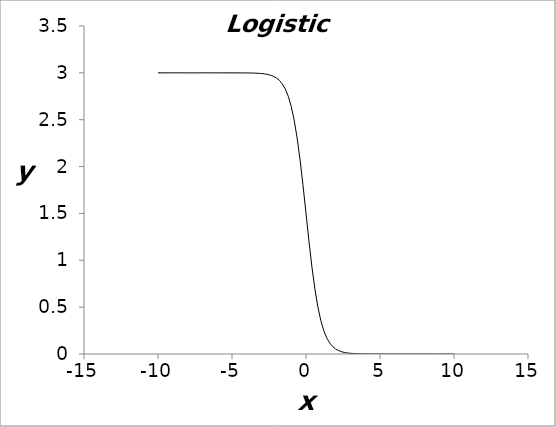
| Category | Series 0 |
|---|---|
| -10.0 | 3 |
| -9.8 | 3 |
| -9.600000000000001 | 3 |
| -9.400000000000002 | 3 |
| -9.200000000000003 | 3 |
| -9.000000000000004 | 3 |
| -8.800000000000004 | 3 |
| -8.600000000000005 | 3 |
| -8.400000000000006 | 3 |
| -8.200000000000006 | 3 |
| -8.000000000000007 | 3 |
| -7.800000000000007 | 3 |
| -7.600000000000007 | 3 |
| -7.400000000000006 | 3 |
| -7.200000000000006 | 3 |
| -7.000000000000006 | 3 |
| -6.800000000000006 | 3 |
| -6.600000000000006 | 3 |
| -6.400000000000005 | 3 |
| -6.200000000000005 | 3 |
| -6.000000000000005 | 3 |
| -5.800000000000005 | 3 |
| -5.600000000000005 | 3 |
| -5.400000000000004 | 3 |
| -5.200000000000004 | 3 |
| -5.000000000000004 | 3 |
| -4.800000000000004 | 3 |
| -4.600000000000004 | 3 |
| -4.400000000000004 | 3 |
| -4.200000000000004 | 2.999 |
| -4.000000000000004 | 2.999 |
| -3.800000000000003 | 2.998 |
| -3.600000000000003 | 2.998 |
| -3.400000000000003 | 2.997 |
| -3.200000000000003 | 2.995 |
| -3.000000000000003 | 2.993 |
| -2.800000000000002 | 2.989 |
| -2.600000000000002 | 2.984 |
| -2.400000000000002 | 2.976 |
| -2.200000000000002 | 2.964 |
| -2.000000000000002 | 2.946 |
| -1.800000000000002 | 2.92 |
| -1.600000000000002 | 2.883 |
| -1.400000000000002 | 2.828 |
| -1.200000000000002 | 2.75 |
| -1.000000000000002 | 2.642 |
| -0.800000000000002 | 2.496 |
| -0.600000000000002 | 2.306 |
| -0.400000000000002 | 2.07 |
| -0.200000000000002 | 1.796 |
| -2.05391259555654e-15 | 1.5 |
| 0.199999999999998 | 1.204 |
| 0.399999999999998 | 0.93 |
| 0.599999999999998 | 0.694 |
| 0.799999999999998 | 0.504 |
| 0.999999999999998 | 0.358 |
| 1.199999999999998 | 0.25 |
| 1.399999999999998 | 0.172 |
| 1.599999999999998 | 0.117 |
| 1.799999999999998 | 0.08 |
| 1.999999999999998 | 0.054 |
| 2.199999999999998 | 0.036 |
| 2.399999999999998 | 0.024 |
| 2.599999999999998 | 0.016 |
| 2.799999999999998 | 0.011 |
| 2.999999999999999 | 0.007 |
| 3.199999999999999 | 0.005 |
| 3.399999999999999 | 0.003 |
| 3.599999999999999 | 0.002 |
| 3.799999999999999 | 0.002 |
| 4.0 | 0.001 |
| 4.199999999999999 | 0.001 |
| 4.399999999999999 | 0 |
| 4.6 | 0 |
| 4.8 | 0 |
| 5.0 | 0 |
| 5.2 | 0 |
| 5.4 | 0 |
| 5.6 | 0 |
| 5.800000000000001 | 0 |
| 6.000000000000001 | 0 |
| 6.200000000000001 | 0 |
| 6.400000000000001 | 0 |
| 6.600000000000001 | 0 |
| 6.800000000000002 | 0 |
| 7.000000000000002 | 0 |
| 7.200000000000002 | 0 |
| 7.400000000000002 | 0 |
| 7.600000000000002 | 0 |
| 7.800000000000002 | 0 |
| 8.000000000000002 | 0 |
| 8.200000000000001 | 0 |
| 8.4 | 0 |
| 8.6 | 0 |
| 8.799999999999997 | 0 |
| 8.999999999999998 | 0 |
| 9.199999999999998 | 0 |
| 9.399999999999997 | 0 |
| 9.599999999999996 | 0 |
| 9.799999999999995 | 0 |
| 9.999999999999995 | 0 |